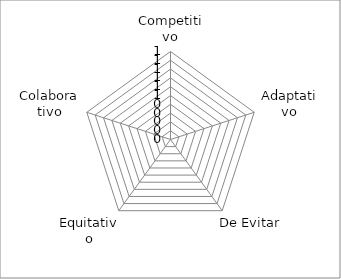
| Category | Series 0 |
|---|---|
| Competitivo | 0 |
| Adaptativo | 0 |
| De Evitar | 0 |
| Equitativo | 0 |
| Colaborativo | 0 |